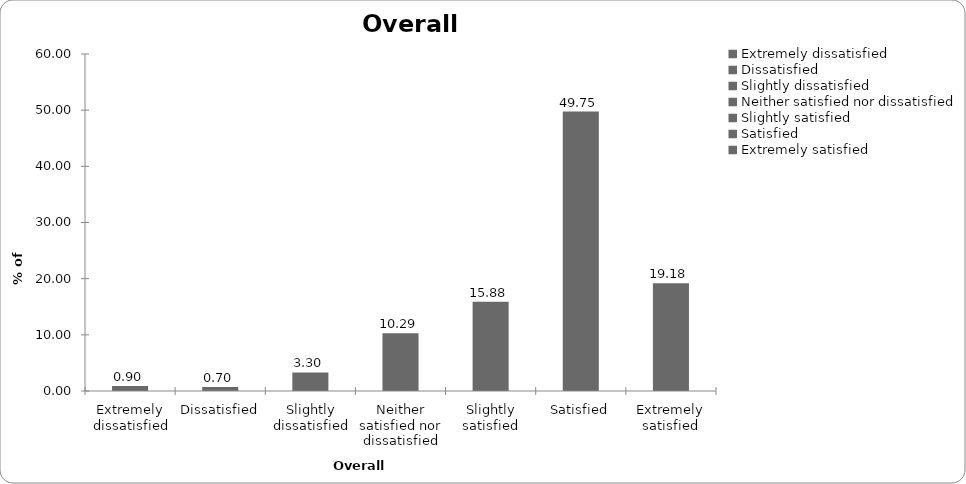
| Category | Overall satisfaction |
|---|---|
| Extremely dissatisfied | 0.899 |
| Dissatisfied | 0.699 |
| Slightly dissatisfied | 3.297 |
| Neither satisfied nor dissatisfied | 10.29 |
| Slightly satisfied | 15.884 |
| Satisfied | 49.75 |
| Extremely satisfied | 19.181 |